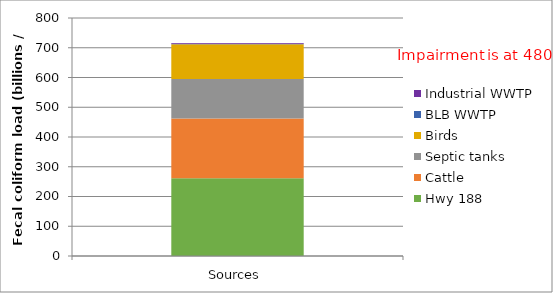
| Category | Hwy 188 | Cattle | Septic tanks | Birds | BLB WWTP | Industrial WWTP |
|---|---|---|---|---|---|---|
| Sources | 261.099 | 201 | 133.137 | 116.9 | 1.06 | 2.99 |